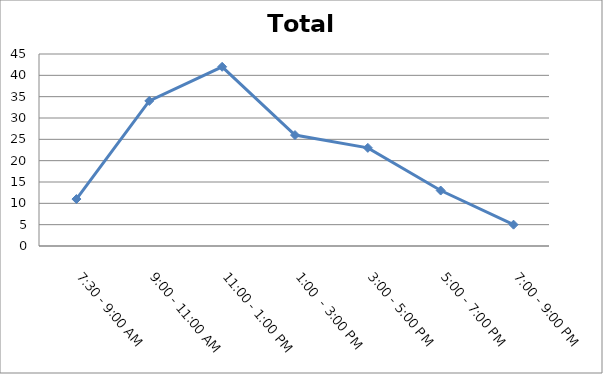
| Category | Total |
|---|---|
| 7:30 - 9:00 AM | 11 |
| 9:00 - 11:00 AM | 34 |
| 11:00 - 1:00 PM | 42 |
| 1:00  - 3:00 PM | 26 |
| 3:00 - 5:00 PM | 23 |
| 5:00 - 7:00 PM | 13 |
| 7:00 - 9:00 PM | 5 |